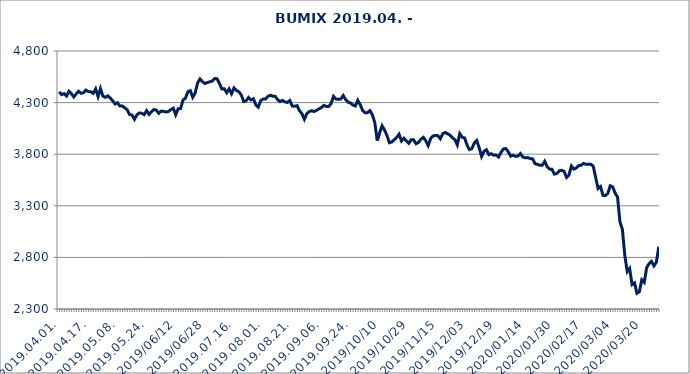
| Category | BUMIX |
|---|---|
| 2019.04.01. | 4404.188 |
| 2019.04.02. | 4377.333 |
| 2019.04.03. | 4387.356 |
| 2019.04.04. | 4363.232 |
| 2019.04.05. | 4410.606 |
| 2019.04.08. | 4387.404 |
| 2019.04.09. | 4355.229 |
| 2019.04.10. | 4384.177 |
| 2019.04.11. | 4409.897 |
| 2019.04.12. | 4390.358 |
| 2019.04.15. | 4395.658 |
| 2019.04.16. | 4421.303 |
| 2019.04.17. | 4406.629 |
| 2019.04.18. | 4405.672 |
| 2019.04.23. | 4390.102 |
| 2019.04.24. | 4432.755 |
| 2019.04.25. | 4358.305 |
| 2019.04.26. | 4436.215 |
| 2019.04.29. | 4362.069 |
| 2019.04.30. | 4351.191 |
| 2019.05.02. | 4365.66 |
| 2019.05.03. | 4344.454 |
| 2019.05.06. | 4319.386 |
| 2019.05.07. | 4286.74 |
| 2019.05.08. | 4299.692 |
| 2019.05.09. | 4267.243 |
| 2019.05.10. | 4266.527 |
| 2019.05.13. | 4249.324 |
| 2019.05.14. | 4230.907 |
| 2019.05.15. | 4184.385 |
| 2019.05.16. | 4179.726 |
| 2019.05.17. | 4137.848 |
| 2019.05.20. | 4181.669 |
| 2019.05.21. | 4199.779 |
| 2019.05.22. | 4197.152 |
| 2019.05.23. | 4183.188 |
| 2019.05.24. | 4221.728 |
| 2019.05.27. | 4185.532 |
| 2019.05.28. | 4211.345 |
| 2019.05.29. | 4233.062 |
| 2019.05.30. | 4227.658 |
| 2019.05.31. | 4196.665 |
| 2019.06.03 | 4218.086 |
| 2019.06.04 | 4215.129 |
| 2019.06.05 | 4209.228 |
| 2019.06.06 | 4213.665 |
| 2019.06.07 | 4232.155 |
| 2019.06.11 | 4245.809 |
| 2019.06.12 | 4182.466 |
| 2019.06.13 | 4240.423 |
| 2019.06.14 | 4242.242 |
| 2019.06.17 | 4325.662 |
| 2019.06.18 | 4341.985 |
| 2019.06.19 | 4405.288 |
| 2019.06.20 | 4416.194 |
| 2019.06.21 | 4351.602 |
| 2019.06.24 | 4392.762 |
| 2019.06.25 | 4489.628 |
| 2019.06.26 | 4528.759 |
| 2019.06.27 | 4503.289 |
| 2019.06.28 | 4485.736 |
| 2019.07.01. | 4493.687 |
| 2019.07.02. | 4501.396 |
| 2019.07.03. | 4508.666 |
| 2019.07.04. | 4532.787 |
| 2019.07.05. | 4531.408 |
| 2019.07.08. | 4484.778 |
| 2019.07.09. | 4432.405 |
| 2019.07.10. | 4433.629 |
| 2019.07.11. | 4396.018 |
| 2019.07.12. | 4432.6 |
| 2019.07.15. | 4386.264 |
| 2019.07.16. | 4442.356 |
| 2019.07.17. | 4417.293 |
| 2019.07.18. | 4405.038 |
| 2019.07.19. | 4374.753 |
| 2019.07.22. | 4310.585 |
| 2019.07.23. | 4317.74 |
| 2019.07.24. | 4349.917 |
| 2019.07.25. | 4324.811 |
| 2019.07.26. | 4337.041 |
| 2019.07.29. | 4276.894 |
| 2019.07.30. | 4255.682 |
| 2019.07.31. | 4318.971 |
| 2019.08.01. | 4333.848 |
| 2019.08.02. | 4334.389 |
| 2019.08.05. | 4360.472 |
| 2019.08.06. | 4371.235 |
| 2019.08.07. | 4361.835 |
| 2019.08.08. | 4360.227 |
| 2019.08.09. | 4326.737 |
| 2019.08.12. | 4310.22 |
| 2019.08.13. | 4321.347 |
| 2019.08.14. | 4306.77 |
| 2019.08.15. | 4301.13 |
| 2019.08.16. | 4320.179 |
| 2019.08.21. | 4266.336 |
| 2019.08.22. | 4265.048 |
| 2019.08.23. | 4270.526 |
| 2019.08.26. | 4221.362 |
| 2019.08.27. | 4192.659 |
| 2019.08.28. | 4138.255 |
| 2019.08.29. | 4192.546 |
| 2019.08.30. | 4213.507 |
| 2019.09.02. | 4220.796 |
| 2019.09.03. | 4213.333 |
| 2019.09.04. | 4224.754 |
| 2019.09.05. | 4239.436 |
| 2019.09.06. | 4251.258 |
| 2019.09.09. | 4272.642 |
| 2019.09.10. | 4263.619 |
| 2019.09.11. | 4261.907 |
| 2019.09.12. | 4289.773 |
| 2019.09.13. | 4360.758 |
| 2019.09.16. | 4333.859 |
| 2019.09.17. | 4332.615 |
| 2019.09.18. | 4334.352 |
| 2019.09.19. | 4368.936 |
| 2019.09.20. | 4328.679 |
| 2019.09.23. | 4303.702 |
| 2019.09.24. | 4296.281 |
| 2019.09.25. | 4276.625 |
| 2019.09.26. | 4267.353 |
| 2019.09.27. | 4322.124 |
| 2019.09.30. | 4280.61 |
| 2019.10.01 | 4223.065 |
| 2019.10.02 | 4201.329 |
| 2019.10.03 | 4201.784 |
| 2019.10.04 | 4222.54 |
| 2019.10.07 | 4182.508 |
| 2019.10.08 | 4107.18 |
| 2019.10.09 | 3932.586 |
| 2019.10.10 | 4007.149 |
| 2019.10.11 | 4074.925 |
| 2019.10.14 | 4035.463 |
| 2019.10.15 | 3983.029 |
| 2019.10.16 | 3911.497 |
| 2019.10.17 | 3918.126 |
| 2019.10.18 | 3939.797 |
| 2019.10.21 | 3962.124 |
| 2019.10.22 | 3993.548 |
| 2019.10.24 | 3928.063 |
| 2019.10.25 | 3955.237 |
| 2019.10.28 | 3928.61 |
| 2019.10.29 | 3905.858 |
| 2019.10.30 | 3938.94 |
| 2019.10.31 | 3939.205 |
| 2019.11.04 | 3900.891 |
| 2019.11.05 | 3914.164 |
| 2019.11.06 | 3944.591 |
| 2019.11.07 | 3962.75 |
| 2019.11.08 | 3930.48 |
| 2019.11.11 | 3882.901 |
| 2019.11.12 | 3951.657 |
| 2019.11.13 | 3976.288 |
| 2019.11.14 | 3981.412 |
| 2019.11.15 | 3979.491 |
| 2019.11.18 | 3949.767 |
| 2019.11.19 | 3998.207 |
| 2019.11.20 | 4010.288 |
| 2019.11.21 | 3998.271 |
| 2019.11.22 | 3983.901 |
| 2019.11.25 | 3958.493 |
| 2019.11.26 | 3941.9 |
| 2019.11.27 | 3889.773 |
| 2019.11.28 | 3999.552 |
| 2019.11.29 | 3964.706 |
| 2019.12.02 | 3957.611 |
| 2019.12.03 | 3889.498 |
| 2019.12.04 | 3844.633 |
| 2019.12.05 | 3853.696 |
| 2019.12.06 | 3908.331 |
| 2019.12.09 | 3932.941 |
| 2019.12.10 | 3862.54 |
| 2019.12.11 | 3777.635 |
| 2019.12.12 | 3827.203 |
| 2019.12.13 | 3842.564 |
| 2019.12.16 | 3795.687 |
| 2019.12.17 | 3804.953 |
| 2019.12.18 | 3790.673 |
| 2019.12.19 | 3792.291 |
| 2019.12.20 | 3773.277 |
| 2019.12.23 | 3817.572 |
| 2019.12.30 | 3851.458 |
| 2020.01.02 | 3855.153 |
| 2020.01.03 | 3822.201 |
| 2020.01.06 | 3781.099 |
| 2020.01.07 | 3790.856 |
| 2020.01.08 | 3779.276 |
| 2020.01.09 | 3782.647 |
| 2020.01.10 | 3806.144 |
| 2020.01.13 | 3772.265 |
| 2020.01.14 | 3765.275 |
| 2020.01.15 | 3767.076 |
| 2020.01.16 | 3758.111 |
| 2020.01.17 | 3754.828 |
| 2020.01.20 | 3708.525 |
| 2020.01.21 | 3700.916 |
| 2020.01.22 | 3692.374 |
| 2020.01.23 | 3693.346 |
| 2020.01.24 | 3731.112 |
| 2020.01.27 | 3679.585 |
| 2020.01.28 | 3655.642 |
| 2020.01.29 | 3654.49 |
| 2020.01.30 | 3607.044 |
| 2020.01.31 | 3613.339 |
| 2020.02.03 | 3638.694 |
| 2020.02.04 | 3644.537 |
| 2020.02.05 | 3633.445 |
| 2020.02.06 | 3575.411 |
| 2020.02.07 | 3599.09 |
| 2020.02.10 | 3685.329 |
| 2020.02.11 | 3655.704 |
| 2020.02.12 | 3665.2 |
| 2020.02.13 | 3689.429 |
| 2020.02.14 | 3692.855 |
| 2020.02.17 | 3710.688 |
| 2020.02.18 | 3702.429 |
| 2020.02.19 | 3702.769 |
| 2020.02.20 | 3702.999 |
| 2020.02.21 | 3683.652 |
| 2020.02.24 | 3573.462 |
| 2020.02.25 | 3467.389 |
| 2020.02.26 | 3486.394 |
| 2020.02.27 | 3401.245 |
| 2020.02.28 | 3399.235 |
| 2020.03.02 | 3420.246 |
| 2020.03.03 | 3494.226 |
| 2020.03.04 | 3483.577 |
| 2020.03.05 | 3423.588 |
| 2020.03.06 | 3385.851 |
| 2020.03.09 | 3144.177 |
| 2020.03.10 | 3072.652 |
| 2020.03.11 | 2820.535 |
| 2020.03.12 | 2662.105 |
| 2020.03.13 | 2692.893 |
| 2020.03.16 | 2536.434 |
| 2020.03.17 | 2553.266 |
| 2020.03.18 | 2452.38 |
| 2020.03.19 | 2467.745 |
| 2020.03.20 | 2582.933 |
| 2020.03.23 | 2557.974 |
| 2020.03.24 | 2699.957 |
| 2020.03.25 | 2740.292 |
| 2020.03.26 | 2762.106 |
| 2020.03.27 | 2717.193 |
| 2020.03.30 | 2753.32 |
| 2020.03.31 | 2903.405 |